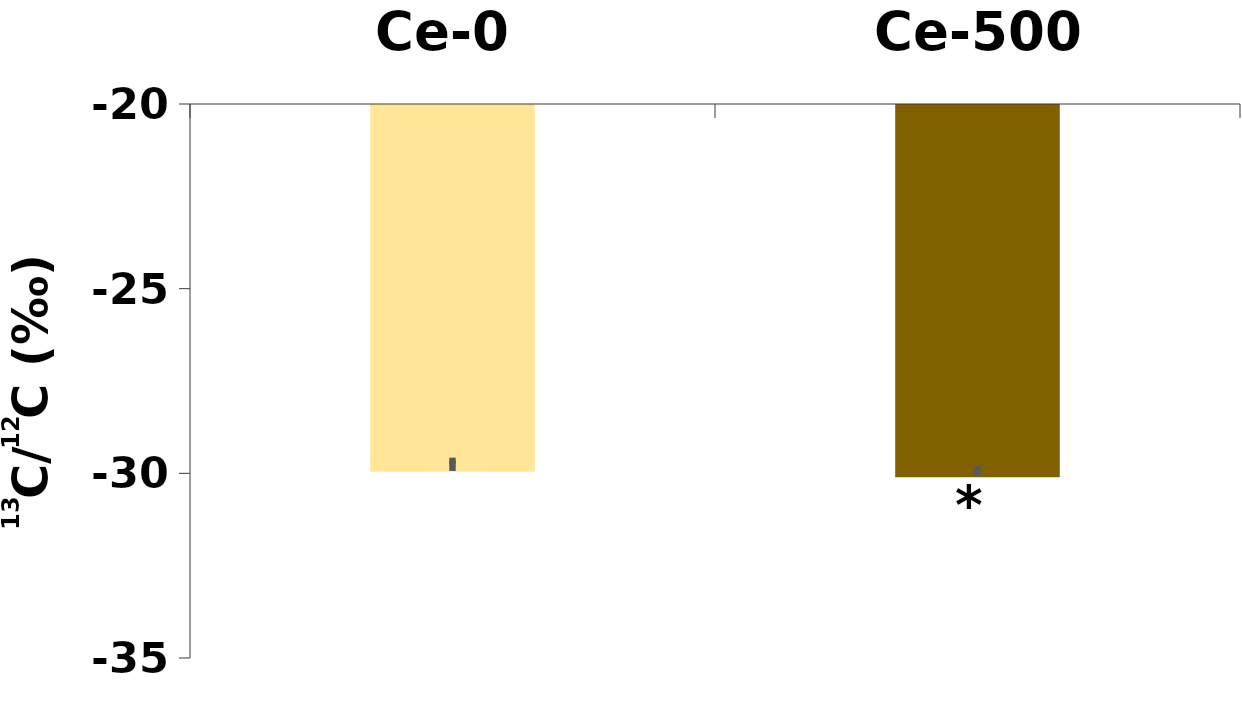
| Category | δ13C |
|---|---|
| Ce-0 | -29.932 |
| Ce-500 | -30.08 |